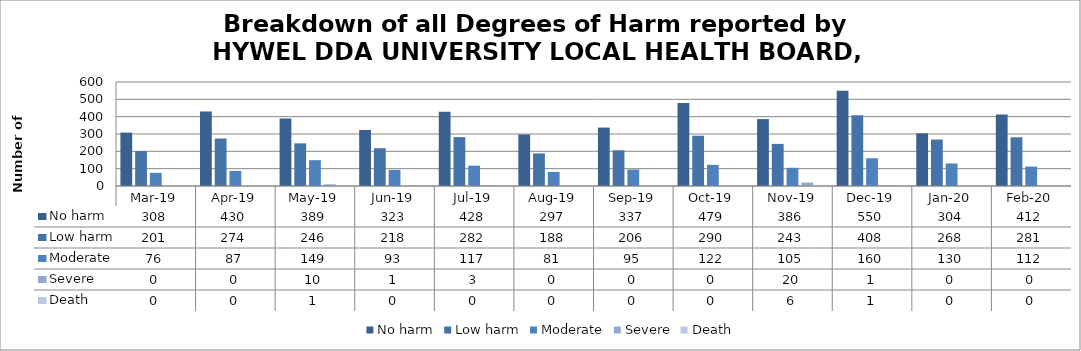
| Category | No harm | Low harm | Moderate | Severe | Death |
|---|---|---|---|---|---|
| Mar-19 | 308 | 201 | 76 | 0 | 0 |
| Apr-19 | 430 | 274 | 87 | 0 | 0 |
| May-19 | 389 | 246 | 149 | 10 | 1 |
| Jun-19 | 323 | 218 | 93 | 1 | 0 |
| Jul-19 | 428 | 282 | 117 | 3 | 0 |
| Aug-19 | 297 | 188 | 81 | 0 | 0 |
| Sep-19 | 337 | 206 | 95 | 0 | 0 |
| Oct-19 | 479 | 290 | 122 | 0 | 0 |
| Nov-19 | 386 | 243 | 105 | 20 | 6 |
| Dec-19 | 550 | 408 | 160 | 1 | 1 |
| Jan-20 | 304 | 268 | 130 | 0 | 0 |
| Feb-20 | 412 | 281 | 112 | 0 | 0 |